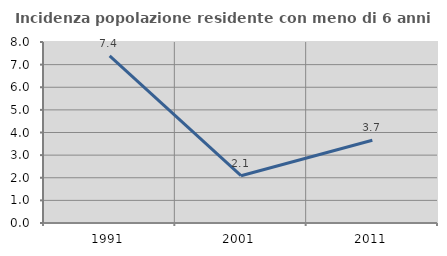
| Category | Incidenza popolazione residente con meno di 6 anni |
|---|---|
| 1991.0 | 7.383 |
| 2001.0 | 2.091 |
| 2011.0 | 3.654 |